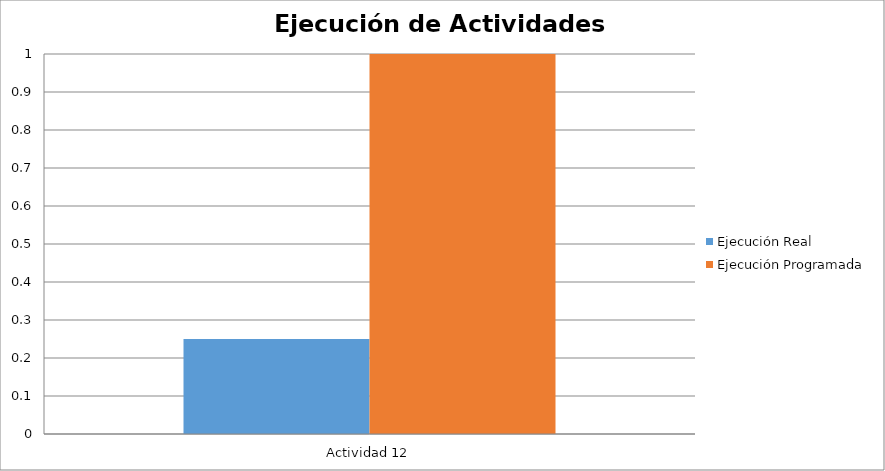
| Category | Ejecución Real | Ejecución Programada |
|---|---|---|
| Actividad 12 | 0.25 | 1 |